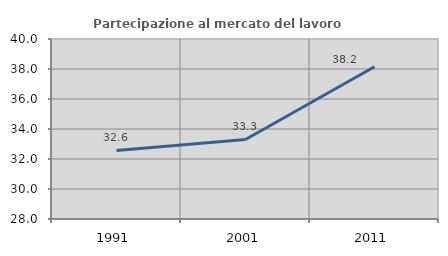
| Category | Partecipazione al mercato del lavoro  femminile |
|---|---|
| 1991.0 | 32.571 |
| 2001.0 | 33.302 |
| 2011.0 | 38.15 |